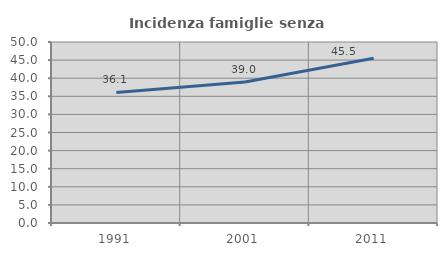
| Category | Incidenza famiglie senza nuclei |
|---|---|
| 1991.0 | 36.069 |
| 2001.0 | 38.951 |
| 2011.0 | 45.502 |